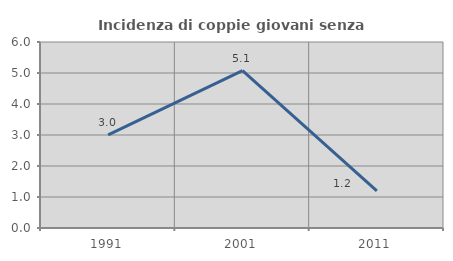
| Category | Incidenza di coppie giovani senza figli |
|---|---|
| 1991.0 | 3.004 |
| 2001.0 | 5.078 |
| 2011.0 | 1.195 |